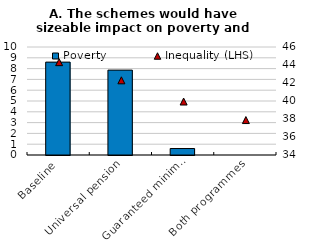
| Category | Poverty |
|---|---|
| Baseline | 8.6 |
| Universal pension | 7.86 |
| Guaranteed minimum income | 0.6 |
| Both programmes | 0 |